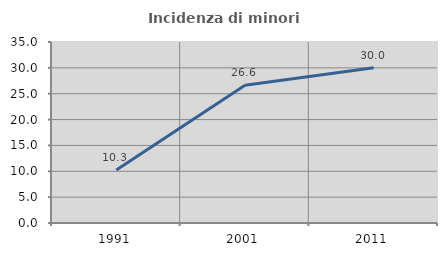
| Category | Incidenza di minori stranieri |
|---|---|
| 1991.0 | 10.256 |
| 2001.0 | 26.636 |
| 2011.0 | 30.028 |